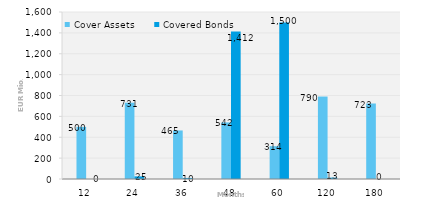
| Category | Cover Assets | Covered Bonds |
|---|---|---|
| 12.0 | 499.722 | 0 |
| 24.0 | 731.07 | 25 |
| 36.0 | 465.024 | 10 |
| 48.0 | 542.057 | 1412.42 |
| 60.0 | 314.444 | 1500 |
| 120.0 | 789.994 | 13 |
| 180.0 | 723.362 | 0 |